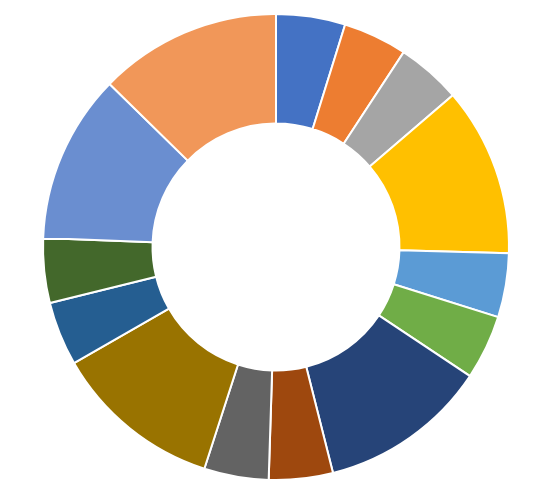
| Category | AD COST |
|---|---|
| CAMPAIGN 1 | 23661 |
| CAMPAIGN 2 | 21882 |
| CAMPAIGN 3 | 22076 |
| CAMPAIGN 4 | 57823 |
| CAMPAIGN 5 | 21882 |
| CAMPAIGN 6 | 22076 |
| CAMPAIGN 7 | 57823 |
| CAMPAIGN 8 | 21882 |
| CAMPAIGN 9 | 22076 |
| CAMPAIGN 10 | 57823 |
| CAMPAIGN 11 | 21882 |
| CAMPAIGN 12 | 22076 |
| CAMPAIGN 13 | 57823 |
| CAMPAIGN 14 | 62484 |